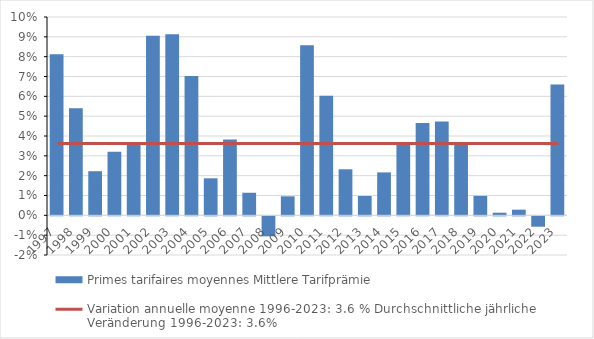
| Category | Primes tarifaires moyennes |
|---|---|
| 1997.0 | 0.081 |
| 1998.0 | 0.054 |
| 1999.0 | 0.022 |
| 2000.0 | 0.032 |
| 2001.0 | 0.036 |
| 2002.0 | 0.09 |
| 2003.0 | 0.091 |
| 2004.0 | 0.07 |
| 2005.0 | 0.019 |
| 2006.0 | 0.038 |
| 2007.0 | 0.011 |
| 2008.0 | -0.01 |
| 2009.0 | 0.01 |
| 2010.0 | 0.086 |
| 2011.0 | 0.06 |
| 2012.0 | 0.023 |
| 2013.0 | 0.01 |
| 2014.0 | 0.022 |
| 2015.0 | 0.037 |
| 2016.0 | 0.047 |
| 2017.0 | 0.047 |
| 2018.0 | 0.036 |
| 2019.0 | 0.01 |
| 2020.0 | 0.001 |
| 2021.0 | 0.003 |
| 2022.0 | -0.005 |
| 2023.0 | 0.066 |